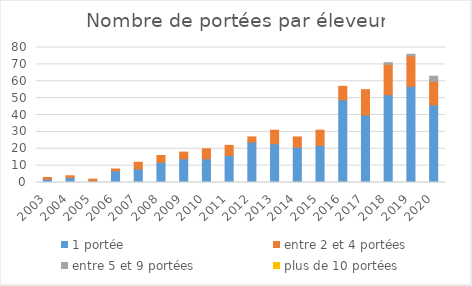
| Category | 1 portée | entre 2 et 4 portées | entre 5 et 9 portées | plus de 10 portées |
|---|---|---|---|---|
| 2003.0 | 2 | 1 | 0 | 0 |
| 2004.0 | 3 | 1 | 0 | 0 |
| 2005.0 | 1 | 1 | 0 | 0 |
| 2006.0 | 7 | 1 | 0 | 0 |
| 2007.0 | 8 | 4 | 0 | 0 |
| 2008.0 | 12 | 4 | 0 | 0 |
| 2009.0 | 14 | 4 | 0 | 0 |
| 2010.0 | 14 | 6 | 0 | 0 |
| 2011.0 | 16 | 6 | 0 | 0 |
| 2012.0 | 24 | 3 | 0 | 0 |
| 2013.0 | 23 | 8 | 0 | 0 |
| 2014.0 | 21 | 6 | 0 | 0 |
| 2015.0 | 22 | 9 | 0 | 0 |
| 2016.0 | 49 | 8 | 0 | 0 |
| 2017.0 | 40 | 15 | 0 | 0 |
| 2018.0 | 52 | 18 | 1 | 0 |
| 2019.0 | 57 | 18 | 1 | 0 |
| 2020.0 | 46 | 14 | 3 | 0 |